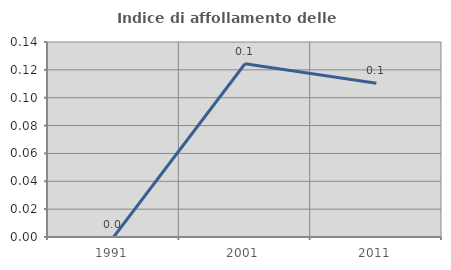
| Category | Indice di affollamento delle abitazioni  |
|---|---|
| 1991.0 | 0 |
| 2001.0 | 0.124 |
| 2011.0 | 0.11 |